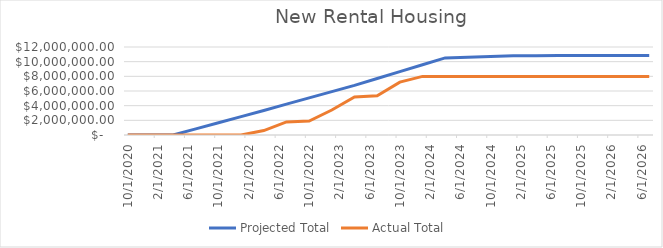
| Category | Projected Total | Actual Total  |
|---|---|---|
| 10/1/20 | 0 | 0 |
| 1/1/21 | 0 | 0 |
| 4/1/21 | 0 | 0 |
| 7/1/21 | 837369.25 | 0 |
| 10/1/21 | 1674738.5 | 0 |
| 1/1/22 | 2512107.75 | 0 |
| 4/1/22 | 3349477 | 607499 |
| 7/1/22 | 4205596.25 | 1788520 |
| 10/1/22 | 5061715.5 | 1911562 |
| 1/1/23 | 5917834.75 | 3409631 |
| 4/1/23 | 6773954 | 5172201 |
| 7/1/23 | 7707716.964 | 5356808.87 |
| 10/1/23 | 8641479.929 | 7211828.72 |
| 1/1/24 | 9575242.893 | 7992603.33 |
| 4/1/24 | 10509005.857 | 7992603.33 |
| 7/1/24 | 10605399.571 | 7992603.33 |
| 10/1/24 | 10701793.286 | 7992603.33 |
| 1/1/25 | 10798187 | 7992603.33 |
| 4/1/25 | 10816937 | 7992603.33 |
| 7/1/25 | 10835687 | 7992603.33 |
| 10/1/25 | 10854437 | 7992603.33 |
| 1/1/26 | 10854437 | 7992603.33 |
| 4/1/26 | 10854437 | 7992603.33 |
| 7/1/26 | 10854437 | 7992603.33 |